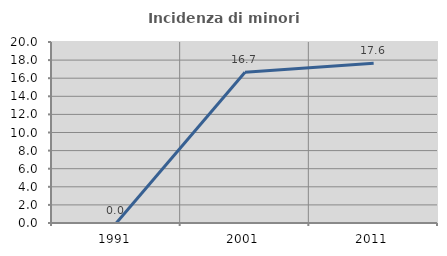
| Category | Incidenza di minori stranieri |
|---|---|
| 1991.0 | 0 |
| 2001.0 | 16.667 |
| 2011.0 | 17.647 |